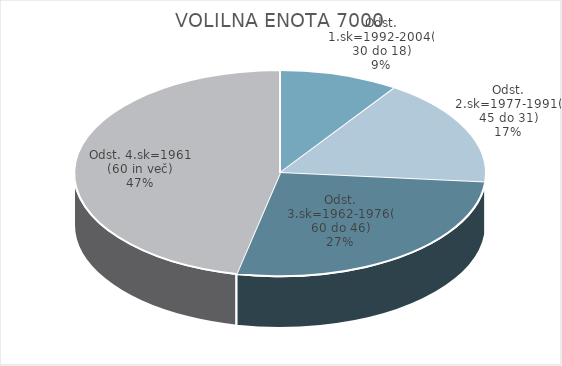
| Category | VOLILNA ENOTA 7000 |
|---|---|
| Odst. 1.sk=1992-2004(30 do 18) | 3.56 |
| Odst. 2.sk=1977-1991(45 do 31) | 6.41 |
| Odst. 3.sk=1962-1976(60 do 46) | 10.15 |
| Odst. 4.sk=1961 (60 in več) | 17.57 |